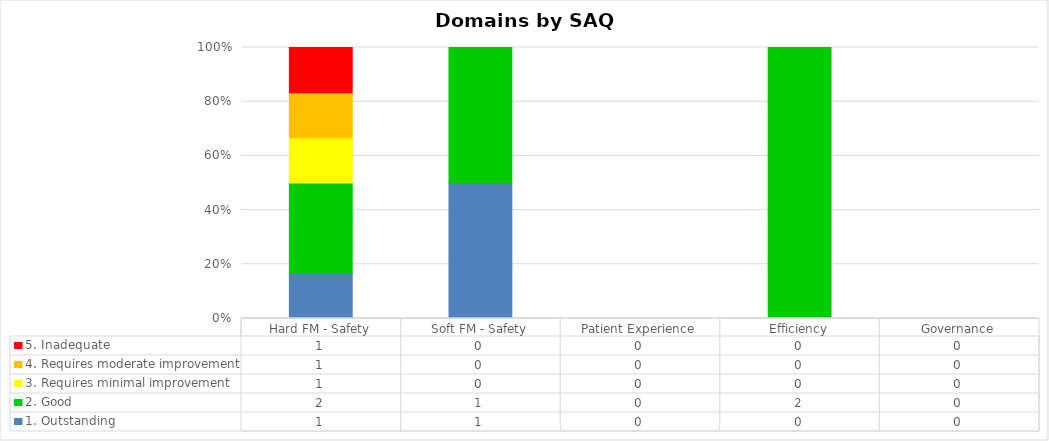
| Category | 1. Outstanding | 2. Good | 3. Requires minimal improvement | 4. Requires moderate improvement | 5. Inadequate |
|---|---|---|---|---|---|
| Hard FM - Safety | 1 | 2 | 1 | 1 | 1 |
| Soft FM - Safety | 1 | 1 | 0 | 0 | 0 |
| Patient Experience | 0 | 0 | 0 | 0 | 0 |
| Efficiency | 0 | 2 | 0 | 0 | 0 |
| Governance | 0 | 0 | 0 | 0 | 0 |